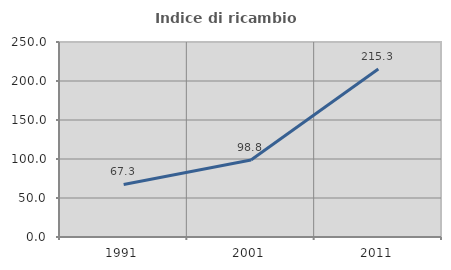
| Category | Indice di ricambio occupazionale  |
|---|---|
| 1991.0 | 67.323 |
| 2001.0 | 98.783 |
| 2011.0 | 215.299 |